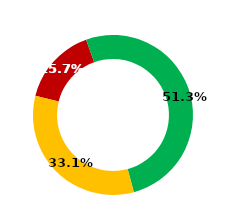
| Category | Series 1 | Series 0 | Series 2 |
|---|---|---|---|
| Retail |  |  | 0.157 |
| Domestic Institutions |  |  | 0.513 |
| Foreign Institutions (Including NVDR 100%) |  |  | 0.331 |